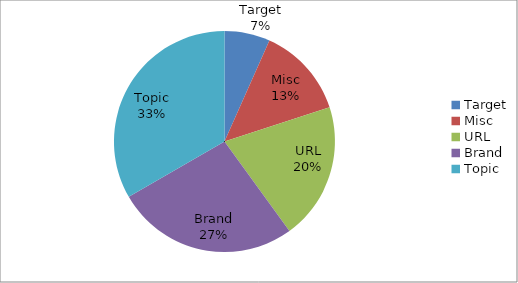
| Category | Series 0 | Series 1 |
|---|---|---|
| Target | 6.667 | 10 |
| Misc | 13.333 | 20 |
| URL | 20 | 30 |
| Brand | 26.667 | 40 |
| Topic | 33.333 | 50 |